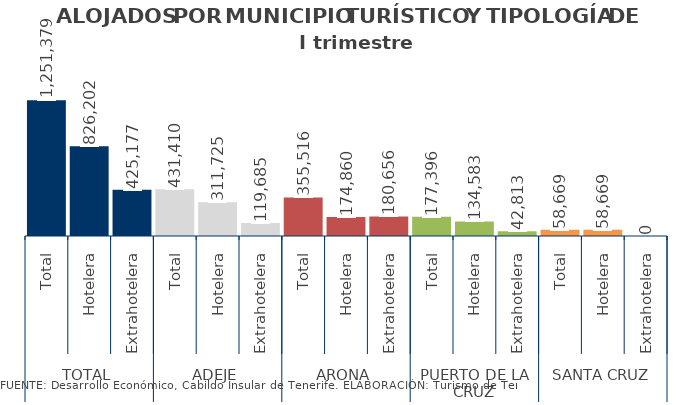
| Category | I trimestre 2014 |
|---|---|
| 0 | 1251379 |
| 1 | 826202 |
| 2 | 425177 |
| 3 | 431410 |
| 4 | 311725 |
| 5 | 119685 |
| 6 | 355516 |
| 7 | 174860 |
| 8 | 180656 |
| 9 | 177396 |
| 10 | 134583 |
| 11 | 42813 |
| 12 | 58669 |
| 13 | 58669 |
| 14 | 0 |